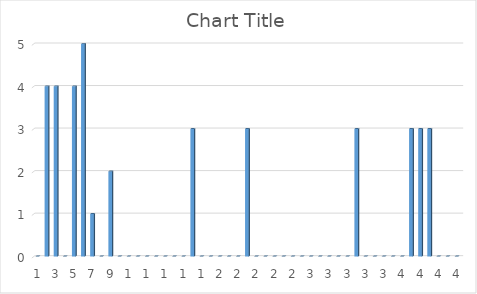
| Category | Series 0 |
|---|---|
| 0 | 0 |
| 1 | 4 |
| 2 | 4 |
| 3 | 0 |
| 4 | 4 |
| 5 | 5 |
| 6 | 1 |
| 7 | 0 |
| 8 | 2 |
| 9 | 0 |
| 10 | 0 |
| 11 | 0 |
| 12 | 0 |
| 13 | 0 |
| 14 | 0 |
| 15 | 0 |
| 16 | 0 |
| 17 | 3 |
| 18 | 0 |
| 19 | 0 |
| 20 | 0 |
| 21 | 0 |
| 22 | 0 |
| 23 | 3 |
| 24 | 0 |
| 25 | 0 |
| 26 | 0 |
| 27 | 0 |
| 28 | 0 |
| 29 | 0 |
| 30 | 0 |
| 31 | 0 |
| 32 | 0 |
| 33 | 0 |
| 34 | 0 |
| 35 | 3 |
| 36 | 0 |
| 37 | 0 |
| 38 | 0 |
| 39 | 0 |
| 40 | 0 |
| 41 | 3 |
| 42 | 3 |
| 43 | 3 |
| 44 | 0 |
| 45 | 0 |
| 46 | 0 |